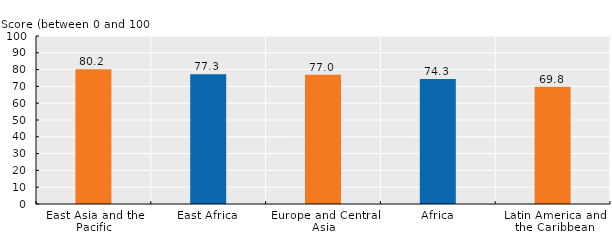
| Category | Average score (between 0 and 100) |
|---|---|
| East Asia and the Pacific | 80.156 |
| East Africa | 77.267 |
| Europe and Central Asia | 76.966 |
| Africa | 74.338 |
| Latin America and the Caribbean | 69.822 |